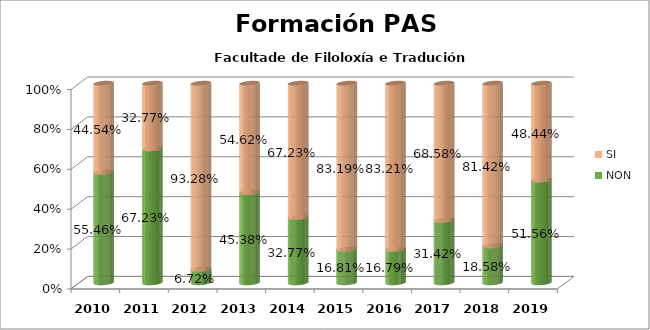
| Category | NON | SI |
|---|---|---|
| 2010.0 | 0.555 | 0.445 |
| 2011.0 | 0.672 | 0.328 |
| 2012.0 | 0.067 | 0.933 |
| 2013.0 | 0.454 | 0.546 |
| 2014.0 | 0.328 | 0.672 |
| 2015.0 | 0.168 | 0.832 |
| 2016.0 | 0.168 | 0.832 |
| 2017.0 | 0.314 | 0.686 |
| 2018.0 | 0.186 | 0.814 |
| 2019.0 | 0.516 | 0.484 |